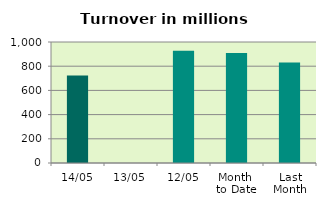
| Category | Series 0 |
|---|---|
| 14/05 | 723.312 |
| 13/05 | 0 |
| 12/05 | 928.369 |
| Month 
to Date | 909.004 |
| Last
Month | 829.993 |